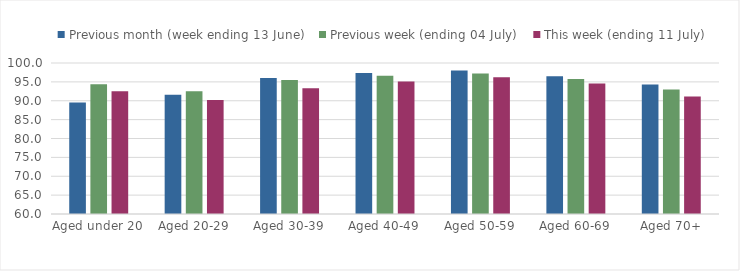
| Category | Previous month (week ending 13 June) | Previous week (ending 04 July) | This week (ending 11 July) |
|---|---|---|---|
| Aged under 20 | 89.507 | 94.345 | 92.509 |
| Aged 20-29 | 91.601 | 92.488 | 90.167 |
| Aged 30-39 | 95.993 | 95.482 | 93.288 |
| Aged 40-49 | 97.319 | 96.59 | 95.129 |
| Aged 50-59 | 98.023 | 97.236 | 96.208 |
| Aged 60-69 | 96.487 | 95.741 | 94.539 |
| Aged 70+ | 94.333 | 93.009 | 91.154 |